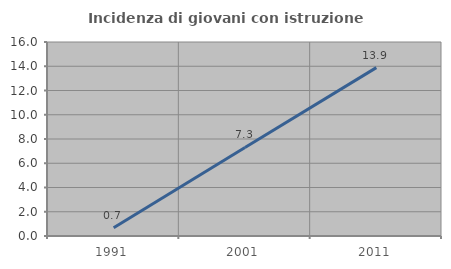
| Category | Incidenza di giovani con istruzione universitaria |
|---|---|
| 1991.0 | 0.676 |
| 2001.0 | 7.299 |
| 2011.0 | 13.889 |